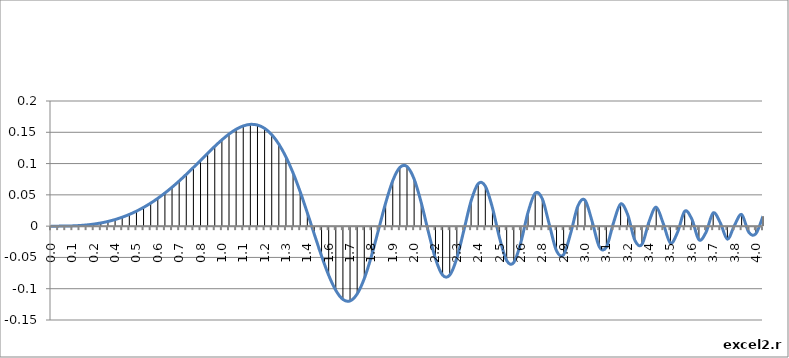
| Category | Series 0 |
|---|---|
| 0.0 | 0 |
| 0.04 | 0 |
| 0.08 | 0 |
| 0.12 | 0 |
| 0.16 | 0.001 |
| 0.2 | 0.002 |
| 0.24 | 0.003 |
| 0.28 | 0.005 |
| 0.32 | 0.007 |
| 0.36 | 0.011 |
| 0.4 | 0.014 |
| 0.44 | 0.019 |
| 0.48 | 0.024 |
| 0.52 | 0.03 |
| 0.56 | 0.037 |
| 0.6 | 0.044 |
| 0.64 | 0.053 |
| 0.68 | 0.062 |
| 0.72 | 0.072 |
| 0.76 | 0.083 |
| 0.8 | 0.094 |
| 0.84 | 0.105 |
| 0.88 | 0.116 |
| 0.92 | 0.127 |
| 0.96 | 0.138 |
| 1.0 | 0.147 |
| 1.04 | 0.155 |
| 1.08 | 0.16 |
| 1.12 | 0.163 |
| 1.16 | 0.162 |
| 1.2 | 0.156 |
| 1.24 | 0.146 |
| 1.28 | 0.131 |
| 1.32 | 0.111 |
| 1.36 | 0.085 |
| 1.4000000000000001 | 0.055 |
| 1.44 | 0.021 |
| 1.48 | -0.014 |
| 1.52 | -0.048 |
| 1.56 | -0.078 |
| 1.6 | -0.103 |
| 1.6400000000000001 | -0.117 |
| 1.68 | -0.119 |
| 1.72 | -0.108 |
| 1.76 | -0.084 |
| 1.8 | -0.048 |
| 1.84 | -0.006 |
| 1.8800000000000001 | 0.037 |
| 1.92 | 0.073 |
| 1.96 | 0.094 |
| 2.0 | 0.095 |
| 2.04 | 0.075 |
| 2.08 | 0.038 |
| 2.12 | -0.009 |
| 2.16 | -0.052 |
| 2.2 | -0.078 |
| 2.24 | -0.078 |
| 2.2800000000000002 | -0.051 |
| 2.32 | -0.006 |
| 2.36 | 0.04 |
| 2.4 | 0.068 |
| 2.44 | 0.064 |
| 2.48 | 0.029 |
| 2.52 | -0.019 |
| 2.56 | -0.055 |
| 2.6 | -0.058 |
| 2.64 | -0.026 |
| 2.68 | 0.022 |
| 2.72 | 0.053 |
| 2.7600000000000002 | 0.044 |
| 2.8000000000000003 | 0.002 |
| 2.84 | -0.039 |
| 2.88 | -0.046 |
| 2.92 | -0.011 |
| 2.96 | 0.032 |
| 3.0 | 0.041 |
| 3.04 | 0.007 |
| 3.08 | -0.033 |
| 3.12 | -0.034 |
| 3.16 | 0.005 |
| 3.2 | 0.035 |
| 3.24 | 0.018 |
| 3.2800000000000002 | -0.023 |
| 3.3200000000000003 | -0.029 |
| 3.36 | 0.007 |
| 3.4 | 0.03 |
| 3.44 | 0.004 |
| 3.48 | -0.027 |
| 3.52 | -0.01 |
| 3.56 | 0.024 |
| 3.6 | 0.011 |
| 3.64 | -0.022 |
| 3.68 | -0.01 |
| 3.72 | 0.021 |
| 3.7600000000000002 | 0.005 |
| 3.8000000000000003 | -0.021 |
| 3.84 | 0.002 |
| 3.88 | 0.019 |
| 3.92 | -0.01 |
| 3.96 | -0.012 |
| 4.0 | 0.016 |